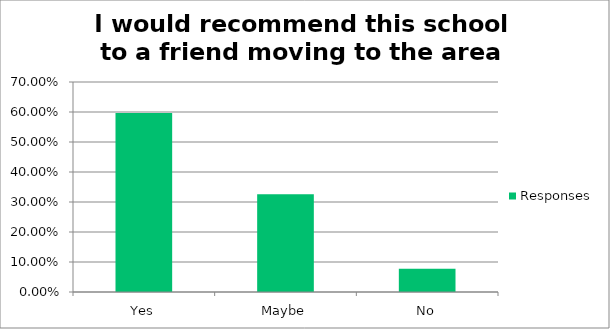
| Category | Responses |
|---|---|
| Yes | 0.597 |
| Maybe | 0.326 |
| No | 0.078 |